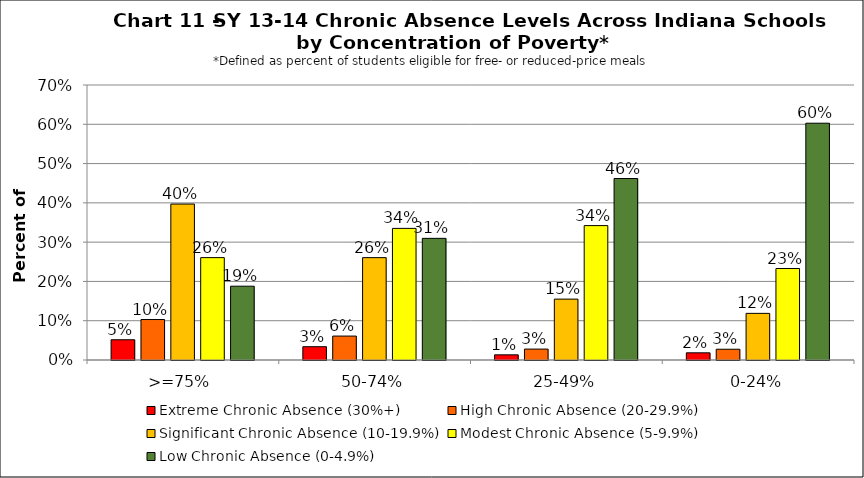
| Category | Extreme Chronic Absence (30%+) | High Chronic Absence (20-29.9%) | Significant Chronic Absence (10-19.9%) | Modest Chronic Absence (5-9.9%) | Low Chronic Absence (0-4.9%) |
|---|---|---|---|---|---|
| 0 | 0.052 | 0.103 | 0.397 | 0.261 | 0.188 |
| 1 | 0.034 | 0.061 | 0.261 | 0.335 | 0.31 |
| 2 | 0.013 | 0.028 | 0.155 | 0.342 | 0.462 |
| 3 | 0.018 | 0.027 | 0.119 | 0.233 | 0.603 |